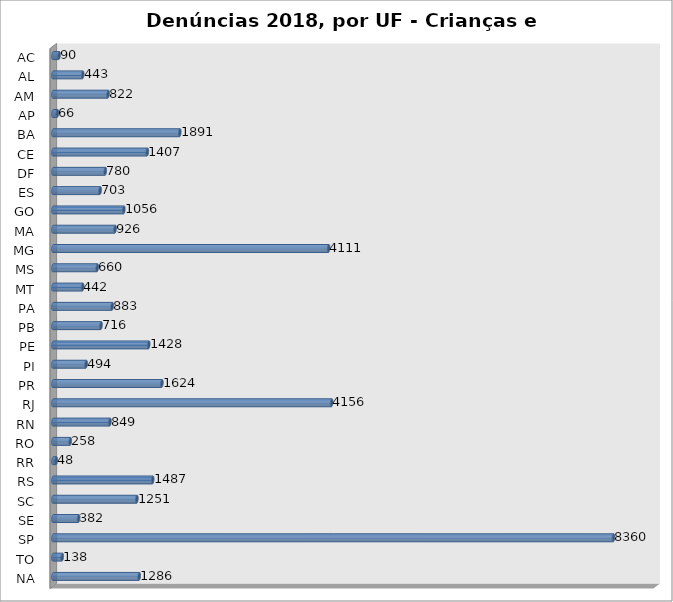
| Category | Series 0 |
|---|---|
| AC | 90 |
| AL | 443 |
| AM | 822 |
| AP | 66 |
| BA | 1891 |
| CE | 1407 |
| DF | 780 |
| ES | 703 |
| GO | 1056 |
| MA | 926 |
| MG | 4111 |
| MS | 660 |
| MT | 442 |
| PA | 883 |
| PB | 716 |
| PE | 1428 |
| PI | 494 |
| PR | 1624 |
| RJ | 4156 |
| RN | 849 |
| RO | 258 |
| RR | 48 |
| RS | 1487 |
| SC | 1251 |
| SE | 382 |
| SP | 8360 |
| TO | 138 |
| NA | 1286 |